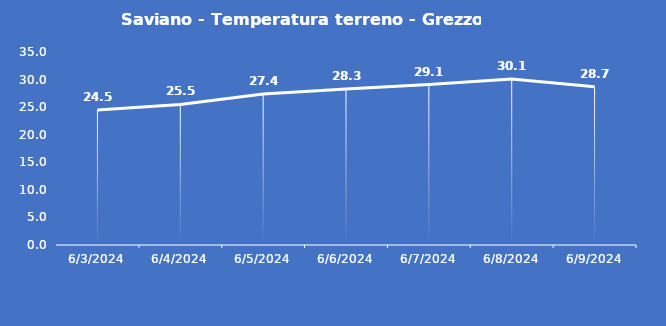
| Category | Saviano - Temperatura terreno - Grezzo (°C) |
|---|---|
| 6/3/24 | 24.5 |
| 6/4/24 | 25.5 |
| 6/5/24 | 27.4 |
| 6/6/24 | 28.3 |
| 6/7/24 | 29.1 |
| 6/8/24 | 30.1 |
| 6/9/24 | 28.7 |